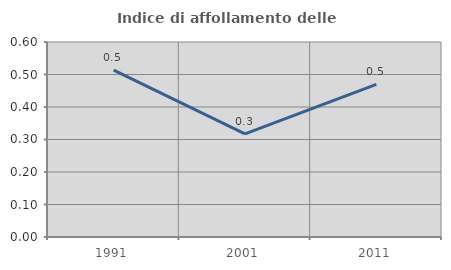
| Category | Indice di affollamento delle abitazioni  |
|---|---|
| 1991.0 | 0.514 |
| 2001.0 | 0.317 |
| 2011.0 | 0.47 |